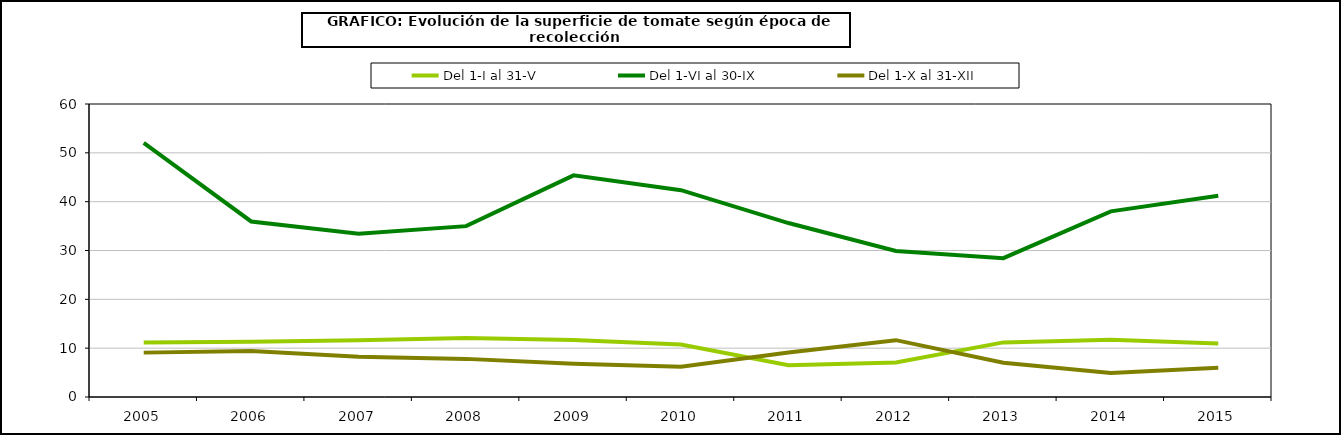
| Category | Del 1-I al 31-V | Del 1-VI al 30-IX | Del 1-X al 31-XII |
|---|---|---|---|
| 2005.0 | 11.149 | 52.049 | 9.087 |
| 2006.0 | 11.312 | 35.942 | 9.436 |
| 2007.0 | 11.626 | 33.45 | 8.221 |
| 2008.0 | 12.07 | 34.991 | 7.807 |
| 2009.0 | 11.671 | 45.383 | 6.784 |
| 2010.0 | 10.742 | 42.349 | 6.176 |
| 2011.0 | 6.491 | 35.62 | 9.093 |
| 2012.0 | 7.086 | 29.889 | 11.641 |
| 2013.0 | 11.18 | 28.439 | 7.005 |
| 2014.0 | 11.722 | 38.024 | 4.929 |
| 2015.0 | 10.934 | 41.208 | 5.992 |